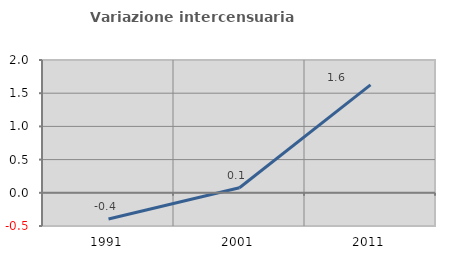
| Category | Variazione intercensuaria annua |
|---|---|
| 1991.0 | -0.394 |
| 2001.0 | 0.076 |
| 2011.0 | 1.624 |